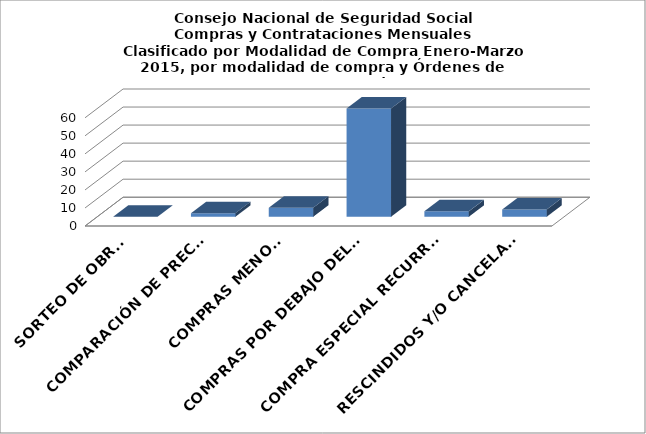
| Category | Series 0 |
|---|---|
| SORTEO DE OBRAS | 0 |
| COMPARACIÓN DE PRECIOS | 2 |
| COMPRAS MENORES | 5 |
| COMPRAS POR DEBAJO DEL UMBRAL MÍNIMO | 60 |
| COMPRA ESPECIAL RECURRENTE | 3 |
| RESCINDIDOS Y/O CANCELADOS | 4 |